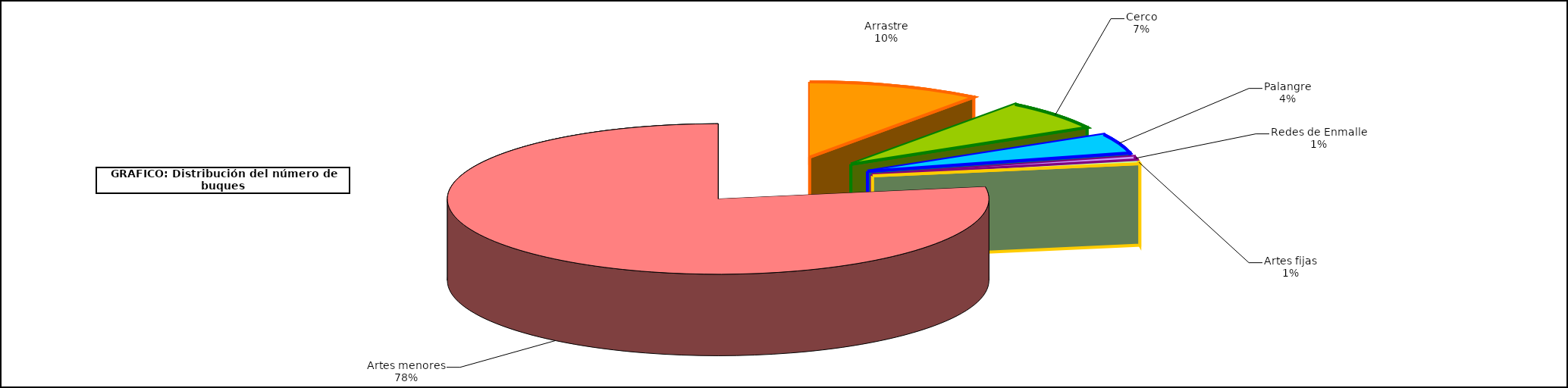
| Category | Series1 |
|---|---|
| 0 | 963 |
| 1 | 605 |
| 2 | 391 |
| 3 | 69 |
| 4 | 55 |
| 5 | 7216 |